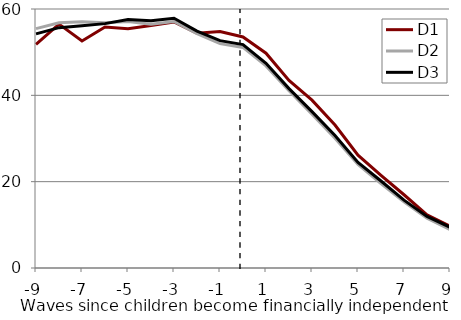
| Category | D1 | D2 | D3 |
|---|---|---|---|
| -9.0 | 51.821 | 55.446 | 54.242 |
| -8.0 | 56.487 | 56.822 | 55.682 |
| -7.0 | 52.599 | 57.023 | 56.102 |
| -6.0 | 55.818 | 56.829 | 56.612 |
| -5.0 | 55.447 | 57.086 | 57.547 |
| -4.0 | 56.175 | 56.47 | 57.263 |
| -3.0 | 56.995 | 57.103 | 57.856 |
| -2.0 | 54.373 | 54.274 | 54.894 |
| -1.0 | 54.761 | 51.978 | 52.664 |
| 0.0 | 53.515 | 51.105 | 51.759 |
| 1.0 | 49.76 | 46.814 | 47.412 |
| 2.0 | 43.458 | 41.099 | 41.554 |
| 3.0 | 38.888 | 35.653 | 36.215 |
| 4.0 | 33.112 | 30.056 | 30.706 |
| 5.0 | 26.147 | 23.985 | 24.452 |
| 6.0 | 21.482 | 19.569 | 20.153 |
| 7.0 | 16.966 | 15.333 | 15.712 |
| 8.0 | 12.317 | 11.544 | 11.961 |
| 9.0 | 9.671 | 8.924 | 9.441 |